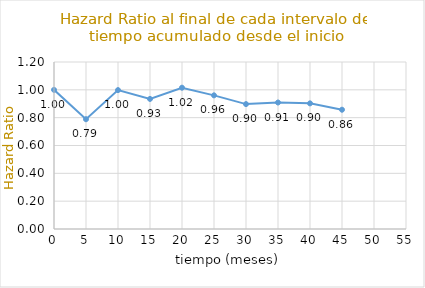
| Category | HRi |
|---|---|
| 0.0 | 1 |
| 5.0 | 0.789 |
| 10.0 | 0.998 |
| 15.0 | 0.935 |
| 20.0 | 1.015 |
| 25.0 | 0.96 |
| 30.0 | 0.897 |
| 35.0 | 0.909 |
| 40.0 | 0.903 |
| 45.0 | 0.857 |